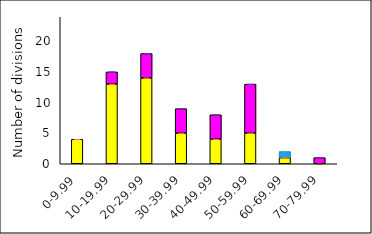
| Category | DTC l4440 | DTC+Sh1 l4440 | Sh1 l4440 |
|---|---|---|---|
| 0-9.99 | 4 | 0 | 0 |
| 10-19.99 | 13 | 2 | 0 |
| 20-29.99 | 14 | 4 | 0 |
| 30-39.99 | 5 | 4 | 0 |
| 40-49.99 | 4 | 4 | 0 |
| 50-59.99 | 5 | 8 | 0 |
| 60-69.99 | 1 | 0 | 1 |
| 70-79.99 | 0 | 1 | 0 |